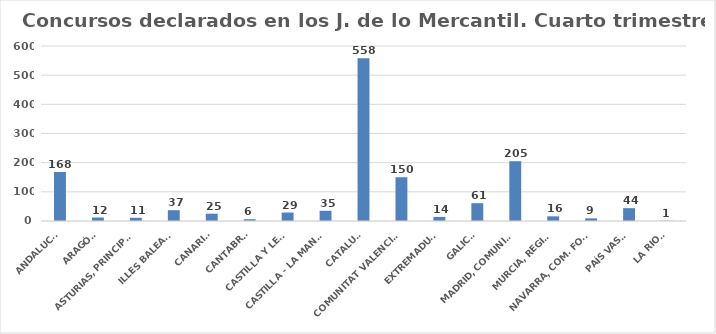
| Category | Series 0 |
|---|---|
| ANDALUCÍA | 168 |
| ARAGÓN | 12 |
| ASTURIAS, PRINCIPADO | 11 |
| ILLES BALEARS | 37 |
| CANARIAS | 25 |
| CANTABRIA | 6 |
| CASTILLA Y LEÓN | 29 |
| CASTILLA - LA MANCHA | 35 |
| CATALUÑA | 558 |
| COMUNITAT VALENCIANA | 150 |
| EXTREMADURA | 14 |
| GALICIA | 61 |
| MADRID, COMUNIDAD | 205 |
| MURCIA, REGIÓN | 16 |
| NAVARRA, COM. FORAL | 9 |
| PAÍS VASCO | 44 |
| LA RIOJA | 1 |